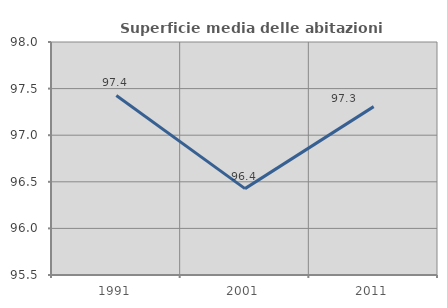
| Category | Superficie media delle abitazioni occupate |
|---|---|
| 1991.0 | 97.426 |
| 2001.0 | 96.427 |
| 2011.0 | 97.307 |